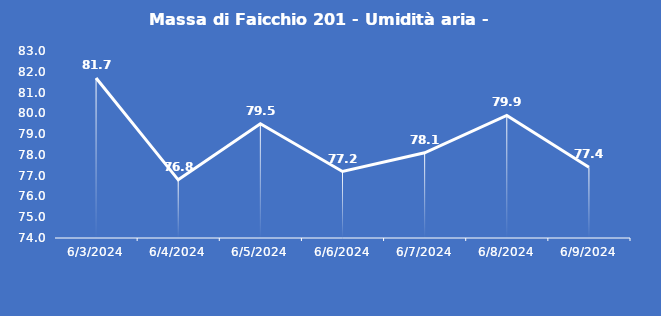
| Category | Massa di Faicchio 201 - Umidità aria - Grezzo (%) |
|---|---|
| 6/3/24 | 81.7 |
| 6/4/24 | 76.8 |
| 6/5/24 | 79.5 |
| 6/6/24 | 77.2 |
| 6/7/24 | 78.1 |
| 6/8/24 | 79.9 |
| 6/9/24 | 77.4 |